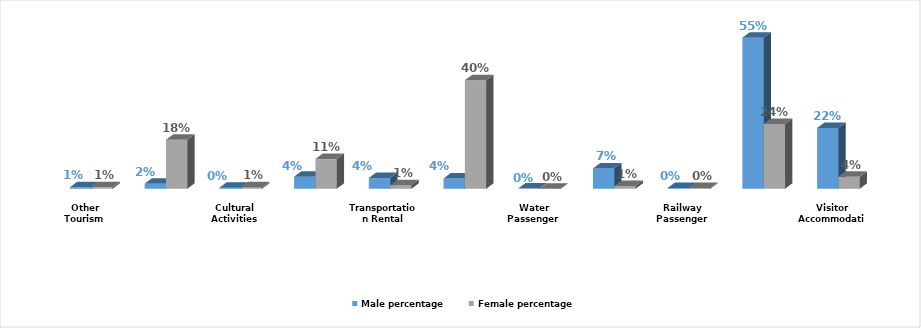
| Category | Male percentage | Female percentage |
|---|---|---|
| Visitor Accommodation | 0.222 | 0.044 |
| Food and Beverage | 0.552 | 0.237 |
| Railway Passenger Transport | 0.003 | 0.002 |
| Land Passenger Transport | 0.074 | 0.01 |
| Water Passenger Transport | 0.001 | 0 |
| Air Passenger Transport | 0.038 | 0.396 |
| Transportation Rental | 0.039 | 0.013 |
| Travel Agencies and Reservation Services | 0.044 | 0.108 |
| Cultural Activities | 0.004 | 0.005 |
| Sports and Recreational Activities | 0.018 | 0.179 |
| Other Tourism Characteristic Services | 0.005 | 0.005 |